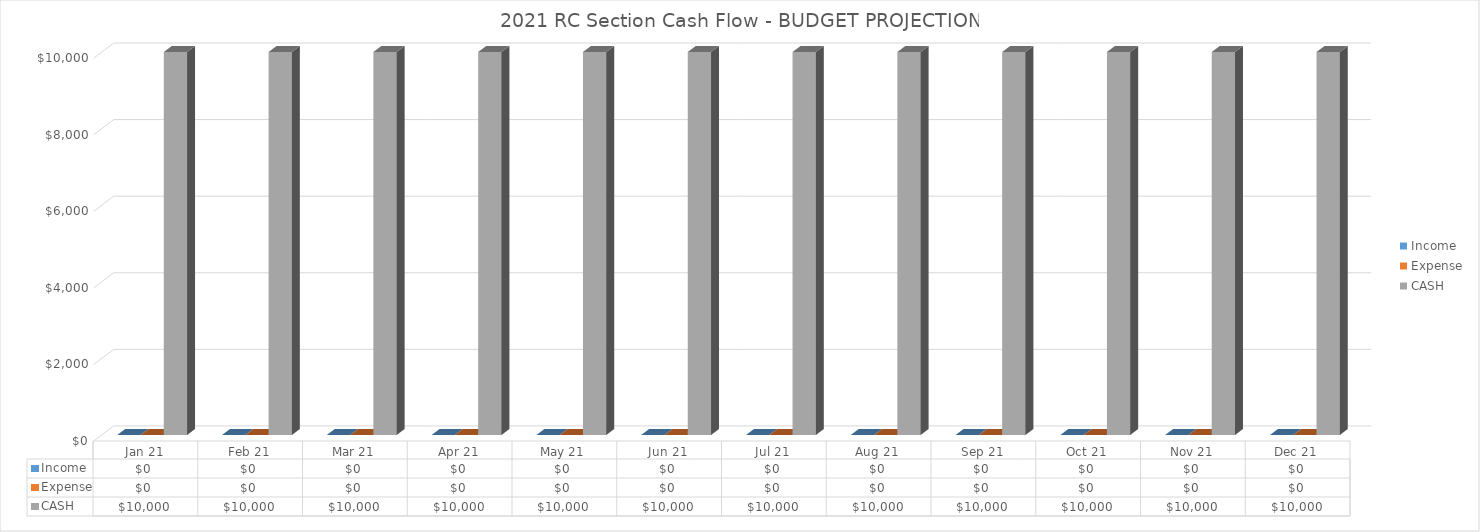
| Category | Income | Expense | CASH |
|---|---|---|---|
| Jan 21 | 0 | 0 | 10000 |
| Feb 21 | 0 | 0 | 10000 |
| Mar 21 | 0 | 0 | 10000 |
| Apr 21 | 0 | 0 | 10000 |
| May 21 | 0 | 0 | 10000 |
| Jun 21 | 0 | 0 | 10000 |
| Jul 21 | 0 | 0 | 10000 |
| Aug 21 | 0 | 0 | 10000 |
| Sep 21 | 0 | 0 | 10000 |
| Oct 21 | 0 | 0 | 10000 |
| Nov 21 | 0 | 0 | 10000 |
| Dec 21 | 0 | 0 | 10000 |